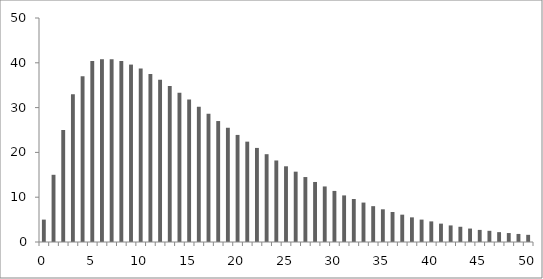
| Category | Series 0 |
|---|---|
| 0.0 | 5 |
| 1.0 | 15 |
| 2.0 | 25 |
| 3.0 | 33 |
| 4.0 | 37 |
| 5.0 | 40.4 |
| 6.0 | 40.8 |
| 7.0 | 40.8 |
| 8.0 | 40.4 |
| 9.0 | 39.6 |
| 10.0 | 38.7 |
| 11.0 | 37.5 |
| 12.0 | 36.2 |
| 13.0 | 34.8 |
| 14.0 | 33.3 |
| 15.0 | 31.8 |
| 16.0 | 30.2 |
| 17.0 | 28.6 |
| 18.0 | 27 |
| 19.0 | 25.5 |
| 20.0 | 23.9 |
| 21.0 | 22.4 |
| 22.0 | 21 |
| 23.0 | 19.6 |
| 24.0 | 18.2 |
| 25.0 | 16.9 |
| 26.0 | 15.7 |
| 27.0 | 14.5 |
| 28.0 | 13.4 |
| 29.0 | 12.4 |
| 30.0 | 11.4 |
| 31.0 | 10.4 |
| 32.0 | 9.6 |
| 33.0 | 8.8 |
| 34.0 | 8 |
| 35.0 | 7.3 |
| 36.0 | 6.7 |
| 37.0 | 6.1 |
| 38.0 | 5.5 |
| 39.0 | 5 |
| 40.0 | 4.6 |
| 41.0 | 4.1 |
| 42.0 | 3.7 |
| 43.0 | 3.4 |
| 44.0 | 3 |
| 45.0 | 2.7 |
| 46.0 | 2.5 |
| 47.0 | 2.2 |
| 48.0 | 2 |
| 49.0 | 1.8 |
| 50.0 | 1.6 |